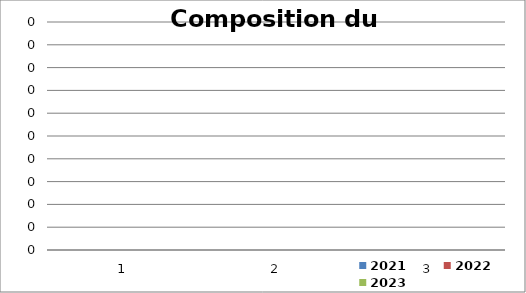
| Category | 2021 | 2022 | 2023 |
|---|---|---|---|
| 0 | 0 | 0 | 0 |
| 1 | 0 | 0 | 0 |
| 2 | 0 | 0 | 0 |